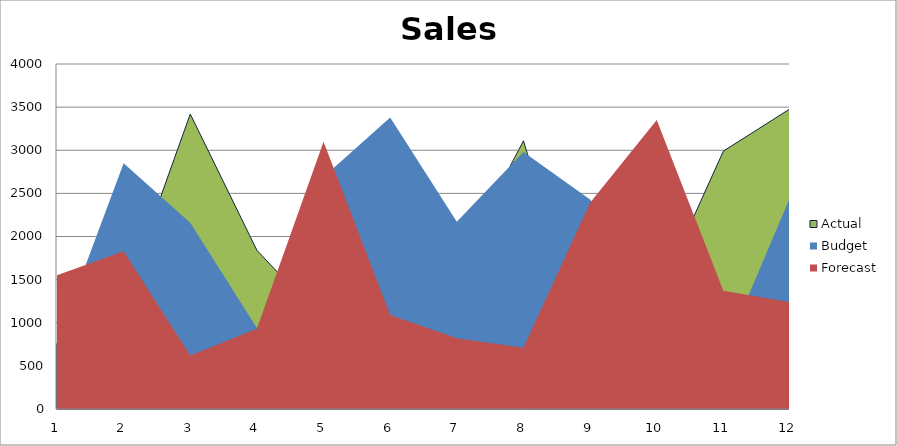
| Category | Actual | Budget | Forecast |
|---|---|---|---|
| 0 | 760 | 780 | 1550 |
| 1 | 1260 | 2850 | 1830 |
| 2 | 3420 | 2160 | 620 |
| 3 | 1840 | 940 | 930 |
| 4 | 1020 | 2690 | 3100 |
| 5 | 3180 | 3380 | 1090 |
| 6 | 1630 | 2170 | 820 |
| 7 | 3110 | 2980 | 710 |
| 8 | 540 | 2430 | 2390 |
| 9 | 1280 | 1340 | 3350 |
| 10 | 2990 | 630 | 1370 |
| 11 | 3480 | 2450 | 1240 |